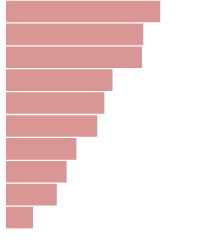
| Category | Series 0 |
|---|---|
| 0 | 7663669.319 |
| 1 | 6812150.506 |
| 2 | 6748080 |
| 3 | 5274872.286 |
| 4 | 4869112.879 |
| 5 | 4509112.879 |
| 6 | 3471834.659 |
| 7 | 2980315.846 |
| 8 | 2489410 |
| 9 | 1303037.626 |